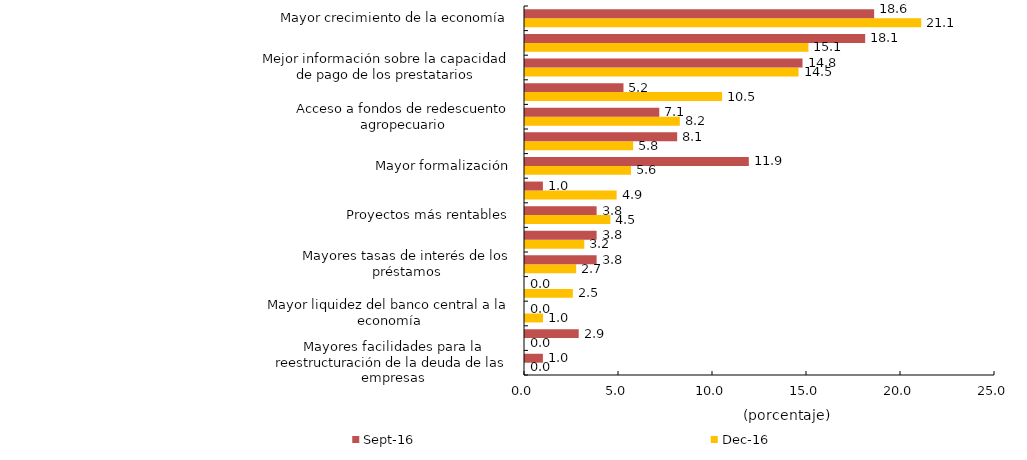
| Category | dic-16 | sep-16 |
|---|---|---|
| Mayores facilidades para la reestructuración de la deuda de las empresas | 0 | 0.952 |
| Otra | 0 | 2.857 |
| Mayor liquidez del banco central a la economía | 0.958 | 0 |
| Mayor capital de las empresas | 2.544 | 0 |
| Mayores tasas de interés de los préstamos | 2.723 | 3.81 |
| Extensión de garantías del sector público a proyectos del sector real | 3.155 | 3.81 |
| Proyectos más rentables | 4.541 | 3.81 |
| Mayor capital de las entidades de microcrédito | 4.875 | 0.952 |
| Mayor formalización | 5.637 | 11.905 |
| Menores costos de recaudo de crédito | 5.753 | 8.095 |
| Acceso a fondos de redescuento agropecuario | 8.235 | 7.143 |
| Mayor disposición de préstamo por parte de algunas entidades financieras a las entidades de microcrédito | 10.485 | 5.238 |
| Mejor información sobre la capacidad de pago de los prestatarios | 14.55 | 14.762 |
| Menores tasas de fondeo | 15.075 | 18.095 |
| Mayor crecimiento de la economía | 21.078 | 18.571 |